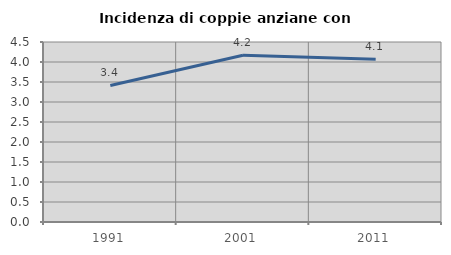
| Category | Incidenza di coppie anziane con figli |
|---|---|
| 1991.0 | 3.413 |
| 2001.0 | 4.17 |
| 2011.0 | 4.068 |